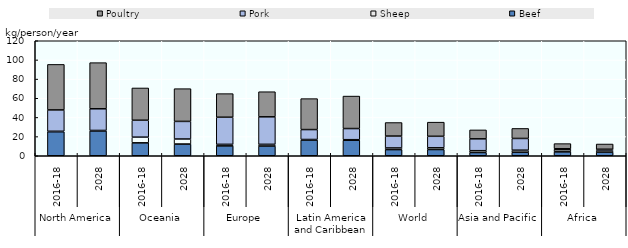
| Category | Beef | Sheep | Pork | Poultry |
|---|---|---|---|---|
| 0 | 25.028 | 0.518 | 22.279 | 47.499 |
| 1 | 25.931 | 0.474 | 22.615 | 48.134 |
| 2 | 13.466 | 5.946 | 17.653 | 33.672 |
| 3 | 12.199 | 5.295 | 18.352 | 34.152 |
| 4 | 10.289 | 1.625 | 28.308 | 24.607 |
| 5 | 10.186 | 1.735 | 28.697 | 26.206 |
| 6 | 16.433 | 0.537 | 10.355 | 32.298 |
| 7 | 16.231 | 0.529 | 11.635 | 33.872 |
| 8 | 6.393 | 1.748 | 12.409 | 14.123 |
| 9 | 6.495 | 1.79 | 12.015 | 14.763 |
| 10 | 3.383 | 1.893 | 12.37 | 9.33 |
| 11 | 3.779 | 2.038 | 12.236 | 10.46 |
| 12 | 4.066 | 2.148 | 1.075 | 5.381 |
| 13 | 3.855 | 1.84 | 1.092 | 5.47 |